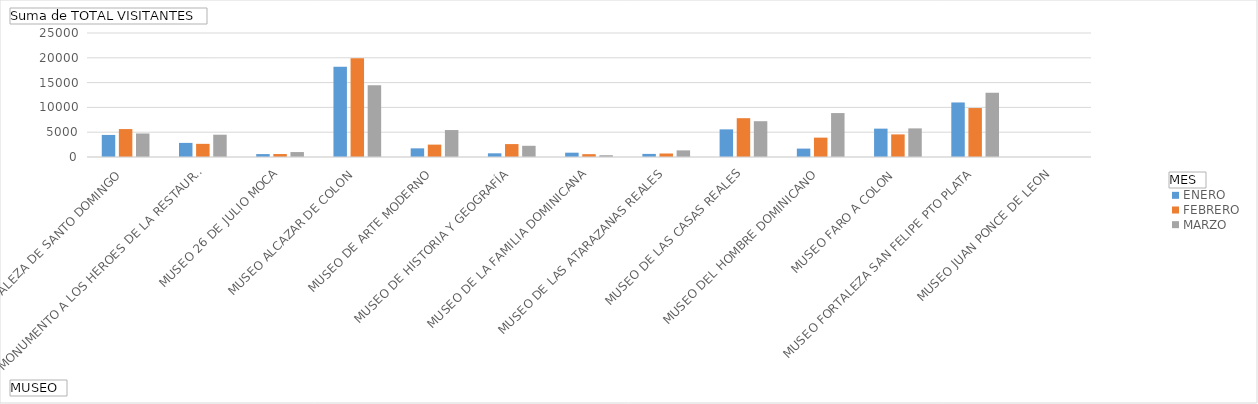
| Category | ENERO | FEBRERO | MARZO |
|---|---|---|---|
| FORTALEZA DE SANTO DOMINGO | 4448 | 5631 | 4744 |
| MONUMENTO A LOS HEROES DE LA RESTAURACION | 2843 | 2654 | 4496 |
| MUSEO 26 DE JULIO MOCA | 589 | 597 | 996 |
| MUSEO ALCAZAR DE COLON | 18177 | 19891 | 14483 |
| MUSEO DE ARTE MODERNO | 1746 | 2496 | 5437 |
| MUSEO DE HISTORIA Y GEOGRAFÍA | 741 | 2604 | 2260 |
| MUSEO DE LA FAMILIA DOMINICANA | 870 | 572 | 356 |
| MUSEO DE LAS ATARAZANAS REALES | 623 | 705 | 1337 |
| MUSEO DE LAS CASAS REALES | 5570 | 7825 | 7218 |
| MUSEO DEL HOMBRE DOMINICANO | 1695 | 3903 | 8857 |
| MUSEO FARO A COLON | 5718 | 4555 | 5768 |
| MUSEO FORTALEZA SAN FELIPE PTO PLATA | 10996 | 9871 | 12929 |
| MUSEO JUAN PONCE DE LEON | 0 | 0 | 0 |